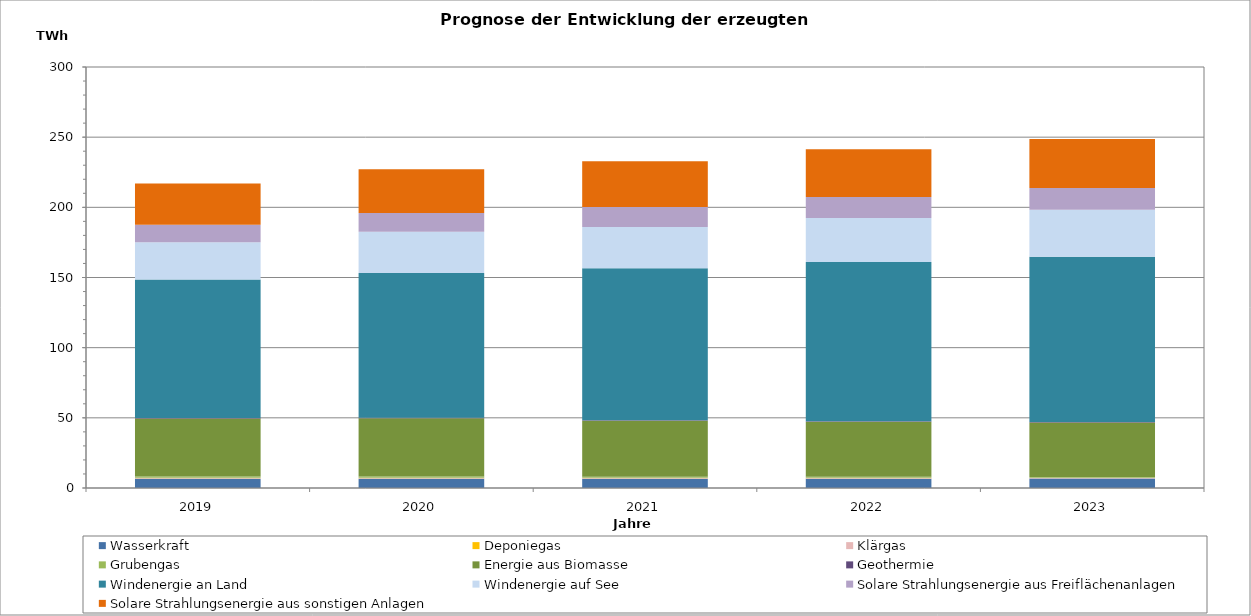
| Category | Wasserkraft | Deponiegas | Klärgas | Grubengas | Energie aus Biomasse | Geothermie | Windenergie an Land | Windenergie auf See | Solare Strahlungsenergie aus Freiflächenanlagen | Solare Strahlungsenergie aus sonstigen Anlagen |
|---|---|---|---|---|---|---|---|---|---|---|
| 2019 | 6514.587 | 301.193 | 525.58 | 881.084 | 41351.62 | 286.386 | 98799.183 | 26466.161 | 12405.123 | 29472.576 |
| 2020 | 6579.213 | 279.403 | 531.006 | 853.316 | 41517.18 | 311.858 | 103214.502 | 29387.973 | 13329.945 | 31131.168 |
| 2021 | 6607.816 | 143.241 | 533.533 | 751.801 | 39872.884 | 335.633 | 108375.196 | 29373.851 | 14203.213 | 32698.217 |
| 2022 | 6654.341 | 106.025 | 537.508 | 691.04 | 39296.779 | 360.21 | 113428.189 | 31352.828 | 14965.643 | 33999.158 |
| 2023 | 6700.926 | 94.786 | 541.487 | 442.155 | 38943.147 | 384.818 | 117767.902 | 33371.728 | 15517.25 | 34914.597 |